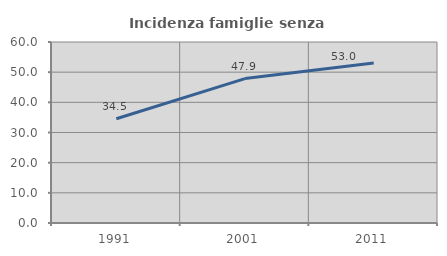
| Category | Incidenza famiglie senza nuclei |
|---|---|
| 1991.0 | 34.54 |
| 2001.0 | 47.872 |
| 2011.0 | 53.018 |